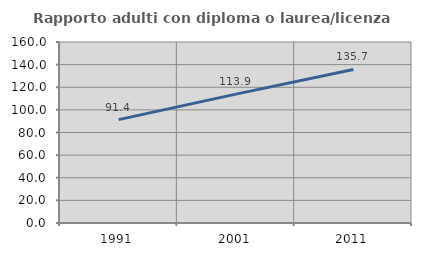
| Category | Rapporto adulti con diploma o laurea/licenza media  |
|---|---|
| 1991.0 | 91.411 |
| 2001.0 | 113.901 |
| 2011.0 | 135.714 |